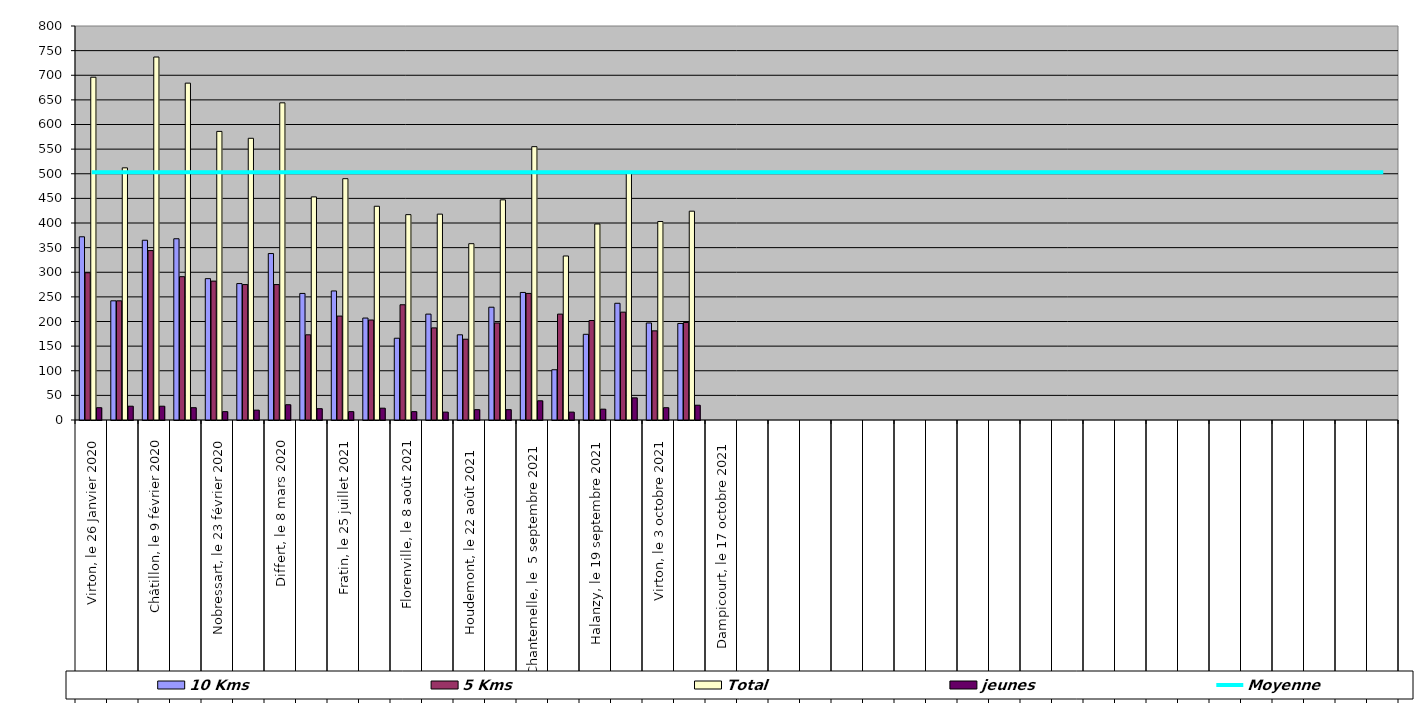
| Category | 10 Kms | 5 Kms | Total | jeunes |
|---|---|---|---|---|
| 0 | 372 | 299 | 696 | 25 |
| 1 | 242 | 242 | 512 | 28 |
| 2 | 365 | 344 | 737 | 28 |
| 3 | 368 | 291 | 684 | 25 |
| 4 | 287 | 282 | 586 | 17 |
| 5 | 277 | 275 | 572 | 20 |
| 6 | 338 | 275 | 644 | 31 |
| 7 | 257 | 173 | 453 | 23 |
| 8 | 262 | 211 | 490 | 17 |
| 9 | 207 | 203 | 434 | 24 |
| 10 | 166 | 234 | 417 | 17 |
| 11 | 215 | 187 | 418 | 16 |
| 12 | 173 | 164 | 358 | 21 |
| 13 | 229 | 197 | 447 | 21 |
| 14 | 259 | 257 | 555 | 39 |
| 15 | 102 | 215 | 333 | 16 |
| 16 | 174 | 202 | 398 | 22 |
| 17 | 237 | 219 | 501 | 45 |
| 18 | 197 | 181 | 403 | 25 |
| 19 | 196 | 198 | 424 | 30 |
| 20 | 0 | 0 | 0 | 0 |
| 21 | 0 | 0 | 0 | 0 |
| 22 | 0 | 0 | 0 | 0 |
| 23 | 0 | 0 | 0 | 0 |
| 24 | 0 | 0 | 0 | 0 |
| 25 | 0 | 0 | 0 | 0 |
| 26 | 0 | 0 | 0 | 0 |
| 27 | 0 | 0 | 0 | 0 |
| 28 | 0 | 0 | 0 | 0 |
| 29 | 0 | 0 | 0 | 0 |
| 30 | 0 | 0 | 0 | 0 |
| 31 | 0 | 0 | 0 | 0 |
| 32 | 0 | 0 | 0 | 0 |
| 33 | 0 | 0 | 0 | 0 |
| 34 | 0 | 0 | 0 | 0 |
| 35 | 0 | 0 | 0 | 0 |
| 36 | 0 | 0 | 0 | 0 |
| 37 | 0 | 0 | 0 | 0 |
| 38 | 0 | 0 | 0 | 0 |
| 39 | 0 | 0 | 0 | 0 |
| 40 | 0 | 0 | 0 | 0 |
| 41 | 0 | 0 | 0 | 0 |